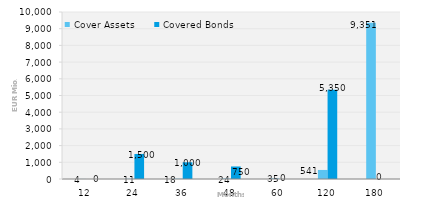
| Category | Cover Assets | Covered Bonds |
|---|---|---|
| 12.0 | 4.24 | 0 |
| 24.0 | 11.388 | 1500 |
| 36.0 | 18.384 | 1000 |
| 48.0 | 24.064 | 750 |
| 60.0 | 35.283 | 0 |
| 120.0 | 541.332 | 5350 |
| 180.0 | 9351.373 | 0 |